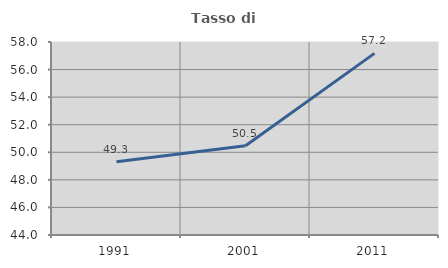
| Category | Tasso di occupazione   |
|---|---|
| 1991.0 | 49.31 |
| 2001.0 | 50.468 |
| 2011.0 | 57.177 |